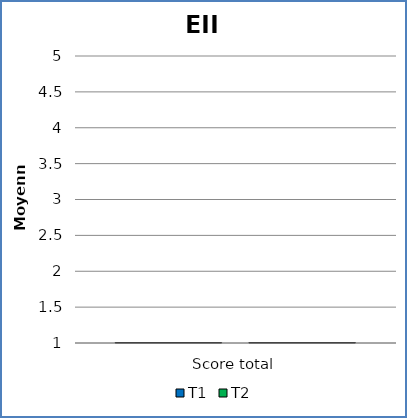
| Category | T1 | T2 |
|---|---|---|
| Score total | 0 | 0 |